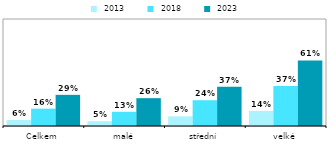
| Category |  2013 |  2018 |  2023 |
|---|---|---|---|
| Celkem | 0.056 | 0.162 | 0.291 |
| malé | 0.045 | 0.133 | 0.26 |
| střední | 0.09 | 0.241 | 0.366 |
| velké | 0.141 | 0.373 | 0.613 |